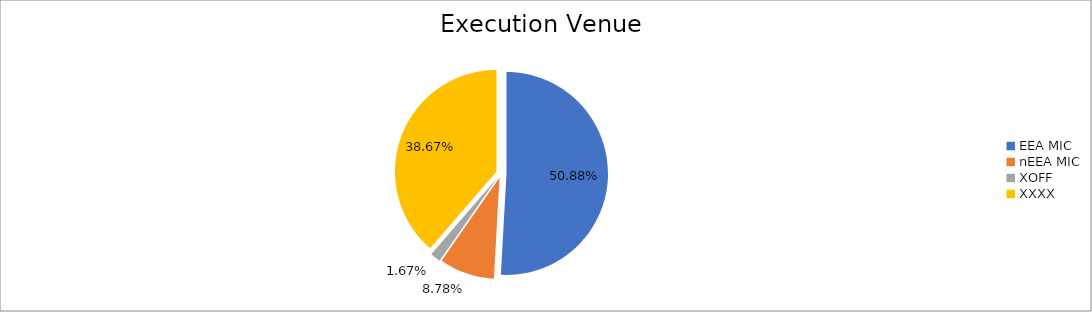
| Category | Series 0 |
|---|---|
| EEA MIC | 7186896.614 |
| nEEA MIC | 1240280.885 |
| XOFF | 235249.75 |
| XXXX | 5462002.591 |